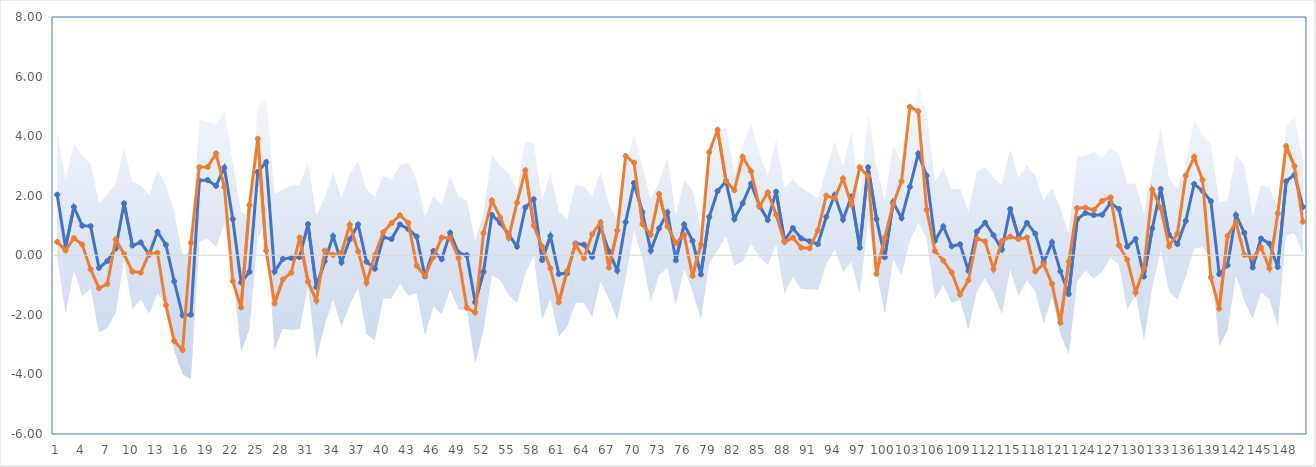
| Category | Forecast | Actual |
|---|---|---|
| 0 | 2.036 | 0.449 |
| 1 | 0.27 | 0.164 |
| 2 | 1.622 | 0.577 |
| 3 | 0.993 | 0.359 |
| 4 | 0.979 | -0.474 |
| 5 | -0.424 | -1.104 |
| 6 | -0.193 | -0.964 |
| 7 | 0.229 | 0.525 |
| 8 | 1.746 | 0.045 |
| 9 | 0.327 | -0.549 |
| 10 | 0.431 | -0.581 |
| 11 | 0.027 | 0.066 |
| 12 | 0.79 | 0.082 |
| 13 | 0.352 | -1.674 |
| 14 | -0.875 | -2.88 |
| 15 | -2.016 | -3.181 |
| 16 | -1.995 | 0.42 |
| 17 | 2.512 | 2.96 |
| 18 | 2.524 | 2.968 |
| 19 | 2.331 | 3.419 |
| 20 | 2.944 | 2.29 |
| 21 | 1.218 | -0.871 |
| 22 | -0.91 | -1.755 |
| 23 | -0.562 | 1.691 |
| 24 | 2.797 | 3.914 |
| 25 | 3.125 | 0.157 |
| 26 | -0.55 | -1.616 |
| 27 | -0.123 | -0.813 |
| 28 | -0.088 | -0.586 |
| 29 | -0.063 | 0.597 |
| 30 | 1.047 | -0.885 |
| 31 | -1.07 | -1.524 |
| 32 | -0.202 | 0.155 |
| 33 | 0.643 | 0.016 |
| 34 | -0.239 | 0.079 |
| 35 | 0.537 | 1.024 |
| 36 | 1.032 | 0.135 |
| 37 | -0.216 | -0.922 |
| 38 | -0.453 | 0.004 |
| 39 | 0.606 | 0.776 |
| 40 | 0.546 | 1.082 |
| 41 | 1.036 | 1.345 |
| 42 | 0.88 | 1.089 |
| 43 | 0.629 | -0.348 |
| 44 | -0.712 | -0.692 |
| 45 | 0.145 | -0.061 |
| 46 | -0.134 | 0.596 |
| 47 | 0.753 | 0.584 |
| 48 | 0.082 | -0.088 |
| 49 | 0.005 | -1.762 |
| 50 | -1.577 | -1.923 |
| 51 | -0.554 | 0.745 |
| 52 | 1.358 | 1.839 |
| 53 | 1.083 | 1.267 |
| 54 | 0.701 | 0.587 |
| 55 | 0.292 | 1.766 |
| 56 | 1.606 | 2.855 |
| 57 | 1.881 | 0.995 |
| 58 | -0.159 | 0.293 |
| 59 | 0.651 | -0.439 |
| 60 | -0.627 | -1.578 |
| 61 | -0.6 | -0.531 |
| 62 | 0.397 | 0.366 |
| 63 | 0.357 | -0.099 |
| 64 | -0.054 | 0.707 |
| 65 | 0.954 | 1.107 |
| 66 | 0.128 | -0.415 |
| 67 | -0.515 | 0.834 |
| 68 | 1.113 | 3.335 |
| 69 | 2.425 | 3.109 |
| 70 | 1.448 | 1.046 |
| 71 | 0.155 | 0.691 |
| 72 | 0.905 | 2.058 |
| 73 | 1.444 | 0.97 |
| 74 | -0.169 | 0.414 |
| 75 | 1.034 | 0.687 |
| 76 | 0.487 | -0.694 |
| 77 | -0.642 | 0.359 |
| 78 | 1.289 | 3.466 |
| 79 | 2.156 | 4.217 |
| 80 | 2.482 | 2.499 |
| 81 | 1.211 | 2.183 |
| 82 | 1.744 | 3.304 |
| 83 | 2.402 | 2.821 |
| 84 | 1.668 | 1.634 |
| 85 | 1.182 | 2.112 |
| 86 | 2.134 | 1.364 |
| 87 | 0.489 | 0.439 |
| 88 | 0.913 | 0.592 |
| 89 | 0.568 | 0.258 |
| 90 | 0.469 | 0.234 |
| 91 | 0.375 | 0.84 |
| 92 | 1.292 | 2.002 |
| 93 | 2.023 | 1.909 |
| 94 | 1.196 | 2.577 |
| 95 | 1.974 | 1.697 |
| 96 | 0.253 | 2.956 |
| 97 | 2.956 | 2.646 |
| 98 | 1.215 | -0.622 |
| 99 | -0.066 | 0.591 |
| 100 | 1.781 | 1.722 |
| 101 | 1.248 | 2.482 |
| 102 | 2.298 | 4.981 |
| 103 | 3.412 | 4.835 |
| 104 | 2.678 | 1.53 |
| 105 | 0.488 | 0.143 |
| 106 | 0.97 | -0.179 |
| 107 | 0.302 | -0.58 |
| 108 | 0.369 | -1.315 |
| 109 | -0.52 | -0.838 |
| 110 | 0.798 | 0.558 |
| 111 | 1.097 | 0.468 |
| 112 | 0.671 | -0.47 |
| 113 | 0.19 | 0.475 |
| 114 | 1.555 | 0.627 |
| 115 | 0.614 | 0.542 |
| 116 | 1.09 | 0.6 |
| 117 | 0.726 | -0.542 |
| 118 | -0.24 | -0.295 |
| 119 | 0.436 | -0.959 |
| 120 | -0.539 | -2.268 |
| 121 | -1.301 | -0.211 |
| 122 | 1.208 | 1.585 |
| 123 | 1.418 | 1.599 |
| 124 | 1.347 | 1.523 |
| 125 | 1.361 | 1.828 |
| 126 | 1.758 | 1.943 |
| 127 | 1.555 | 0.338 |
| 128 | 0.29 | -0.149 |
| 129 | 0.549 | -1.252 |
| 130 | -0.717 | -0.433 |
| 131 | 0.907 | 2.205 |
| 132 | 2.227 | 1.59 |
| 133 | 0.689 | 0.303 |
| 134 | 0.378 | 0.735 |
| 135 | 1.152 | 2.672 |
| 136 | 2.394 | 3.302 |
| 137 | 2.163 | 2.529 |
| 138 | 1.818 | -0.745 |
| 139 | -0.63 | -1.79 |
| 140 | -0.336 | 0.654 |
| 141 | 1.35 | 1.108 |
| 142 | 0.757 | 0.014 |
| 143 | -0.41 | -0.078 |
| 144 | 0.564 | 0.262 |
| 145 | 0.392 | -0.439 |
| 146 | -0.396 | 1.404 |
| 147 | 2.484 | 3.666 |
| 148 | 2.705 | 2.991 |
| 149 | 1.623 | 1.129 |